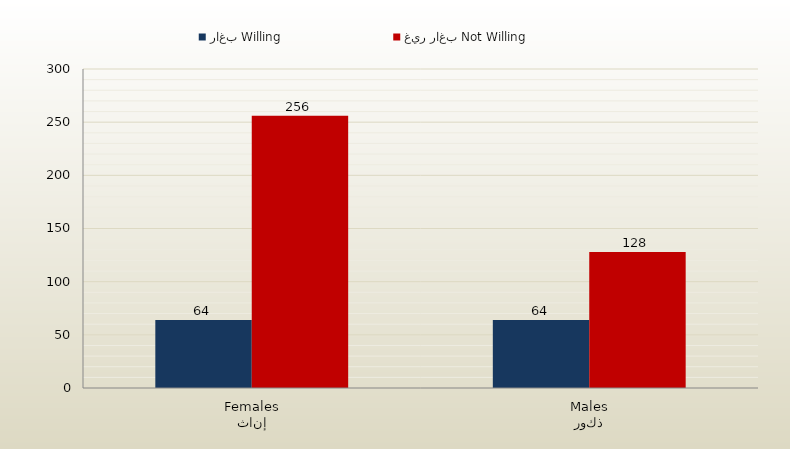
| Category | راغب Willing | غير راغب Not Willing |
|---|---|---|
| إناث
Females | 64 | 256 |
| ذكور
Males | 64 | 128 |